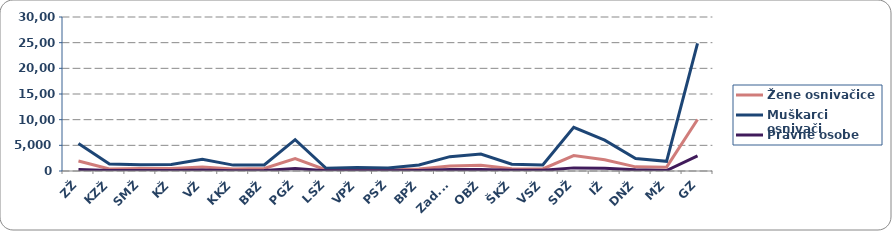
| Category | Žene osnivačice | Muškarci osnivači | Pravne osobe |
|---|---|---|---|
| ZŽ | 1949 | 5336 | 300 |
| KZŽ | 408 | 1362 | 78 |
| SMŽ | 498 | 1211 | 95 |
| KŽ | 477 | 1281 | 92 |
| VŽ | 784 | 2291 | 182 |
| KKŽ | 398 | 1145 | 66 |
| BBŽ | 492 | 1179 | 76 |
| PGŽ | 2422 | 6100 | 502 |
| LSŽ | 199 | 533 | 54 |
| VPŽ | 194 | 663 | 50 |
| PSŽ | 174 | 578 | 32 |
| BPŽ | 382 | 1173 | 89 |
| Zad.Ž. | 977 | 2796 | 272 |
| OBŽ | 1124 | 3313 | 271 |
| ŠKŽ | 444 | 1334 | 170 |
| VSŽ | 401 | 1158 | 128 |
| SDŽ | 3005 | 8524 | 608 |
| IŽ | 2185 | 6001 | 519 |
| DNŽ | 808 | 2416 | 230 |
| MŽ | 747 | 1889 | 98 |
| GZ | 10032 | 24863 | 2959 |